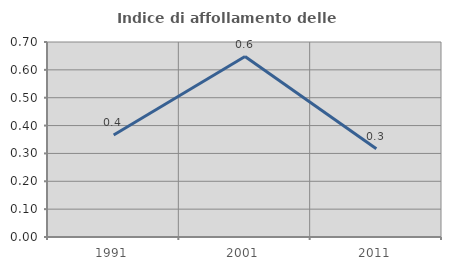
| Category | Indice di affollamento delle abitazioni  |
|---|---|
| 1991.0 | 0.366 |
| 2001.0 | 0.648 |
| 2011.0 | 0.317 |